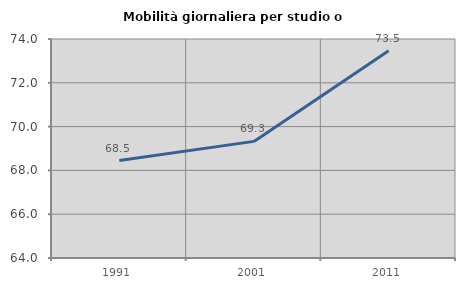
| Category | Mobilità giornaliera per studio o lavoro |
|---|---|
| 1991.0 | 68.451 |
| 2001.0 | 69.325 |
| 2011.0 | 73.46 |